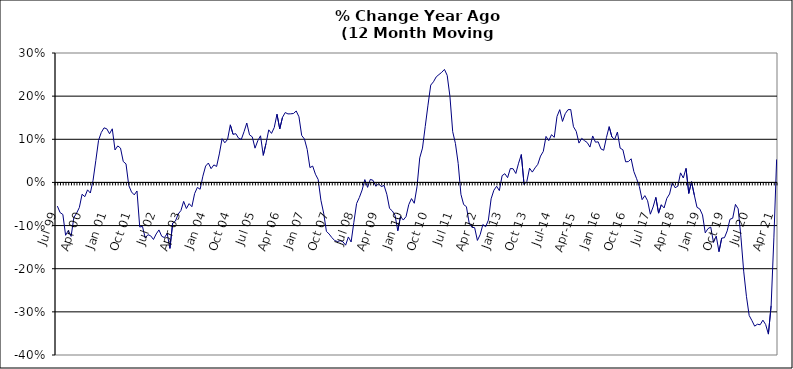
| Category | Series 0 |
|---|---|
| Jul 99 | -0.055 |
| Aug 99 | -0.07 |
| Sep 99 | -0.074 |
| Oct 99 | -0.123 |
| Nov 99 | -0.111 |
| Dec 99 | -0.125 |
| Jan 00 | -0.082 |
| Feb 00 | -0.071 |
| Mar 00 | -0.058 |
| Apr 00 | -0.027 |
| May 00 | -0.033 |
| Jun 00 | -0.017 |
| Jul 00 | -0.025 |
| Aug 00 | 0.005 |
| Sep 00 | 0.05 |
| Oct 00 | 0.098 |
| Nov 00 | 0.116 |
| Dec 00 | 0.127 |
| Jan 01 | 0.124 |
| Feb 01 | 0.113 |
| Mar 01 | 0.124 |
| Apr 01 | 0.075 |
| May 01 | 0.085 |
| Jun 01 | 0.08 |
| Jul 01 | 0.048 |
| Aug 01 | 0.043 |
| Sep 01 | -0.007 |
| Oct 01 | -0.022 |
| Nov 01 | -0.029 |
| Dec 01 | -0.02 |
| Jan 02 | -0.103 |
| Feb 02 | -0.102 |
| Mar 02 | -0.129 |
| Apr 02 | -0.121 |
| May 02 | -0.124 |
| Jun 02 | -0.132 |
| Jul 02 | -0.119 |
| Aug 02 | -0.11 |
| Sep 02 | -0.125 |
| Oct 02 | -0.128 |
| Nov 02 | -0.118 |
| Dec 02 | -0.153 |
| Jan 03 | -0.094 |
| Feb 03 | -0.09 |
| Mar 03 | -0.073 |
| Apr 03 | -0.065 |
| May 03 | -0.044 |
| Jun 03 | -0.06 |
| Jul 03 | -0.049 |
| Aug 03 | -0.056 |
| Sep 03 | -0.026 |
| Oct 03 | -0.012 |
| Nov 03 | -0.016 |
| Dec 03 | 0.014 |
| Jan 04 | 0.038 |
| Feb 04 | 0.045 |
| Mar 04 | 0.032 |
| Apr 04 | 0.041 |
| May 04 | 0.037 |
| Jun 04 | 0.066 |
| Jul 04 | 0.101 |
| Aug 04 | 0.092 |
| Sep 04 | 0.1 |
| Oct 04 | 0.133 |
| Nov 04 | 0.111 |
| Dec 04 | 0.113 |
| Jan 05 | 0.103 |
| Feb 05 | 0.1 |
| Mar 05 | 0.118 |
| Apr 05 | 0.138 |
| May 05 | 0.11 |
| Jun 05 | 0.106 |
| Jul 05 | 0.079 |
| Aug 05 | 0.097 |
| Sep 05 | 0.108 |
| Oct 05 | 0.063 |
| Nov 05 | 0.09 |
| Dec 05 | 0.122 |
| Jan 06 | 0.114 |
| Feb 06 | 0.127 |
| Mar 06 | 0.158 |
| Apr 06 | 0.124 |
| May 06 | 0.151 |
| Jun 06 | 0.162 |
| Jul 06 | 0.159 |
| Aug 06 | 0.159 |
| Sep 06 | 0.16 |
| Oct 06 | 0.166 |
| Nov 06 | 0.152 |
| Dec 06 | 0.109 |
| Jan 07 | 0.101 |
| Feb 07 | 0.076 |
| Mar 07 | 0.034 |
| Apr 07 | 0.038 |
| May 07 | 0.019 |
| Jun 07 | 0.007 |
| Jul 07 | -0.041 |
| Aug 07 | -0.071 |
| Sep 07 | -0.113 |
| Oct 07 | -0.12 |
| Nov 07 | -0.128 |
| Dec 07 | -0.135 |
| Jan 08 | -0.137 |
| Feb 08 | -0.135 |
| Mar 08 | -0.137 |
| Apr 08 | -0.145 |
| May 08 | -0.126 |
| Jun 08 | -0.138 |
| Jul 08 | -0.093 |
| Aug 08 | -0.049 |
| Sep-08 | -0.035 |
| Oct 08 | -0.018 |
| Nov 08 | 0.007 |
| Dec 08 | -0.011 |
| Jan 09 | 0.007 |
| Feb 09 | 0.005 |
| Mar 09 | -0.009 |
| Apr 09 | -0.003 |
| May 09 | -0.01 |
| Jun 09 | -0.007 |
| Jul 09 | -0.027 |
| Aug 09 | -0.06 |
| Sep 09 | -0.066 |
| Oct 09 | -0.076 |
| Nov 09 | -0.112 |
| Dec 09 | -0.079 |
| Jan 10 | -0.087 |
| Feb 10 | -0.079 |
| Mar 10 | -0.052 |
| Apr 10 | -0.037 |
| May 10 | -0.048 |
| Jun 10 | -0.01 |
| Jul 10 | 0.057 |
| Aug 10 | 0.08 |
| Sep 10 | 0.13 |
| Oct 10 | 0.179 |
| Nov 10 | 0.226 |
| Dec 10 | 0.233 |
| Jan 11 | 0.245 |
| Feb 11 | 0.25 |
| Mar 11 | 0.255 |
| Apr 11 | 0.262 |
| May 11 | 0.248 |
| Jun 11 | 0.199 |
| Jul 11 | 0.118 |
| Aug 11 | 0.09 |
| Sep 11 | 0.044 |
| Oct 11 | -0.028 |
| Nov 11 | -0.051 |
| Dec 11 | -0.056 |
| Jan 12 | -0.094 |
| Feb 12 | -0.104 |
| Mar 12 | -0.105 |
| Apr 12 | -0.134 |
| May 12 | -0.121 |
| Jun 12 | -0.098 |
| Jul 12 | -0.103 |
| Aug 12 | -0.087 |
| Sep 12 | -0.038 |
| Oct 12 | -0.018 |
| Nov 12 | -0.009 |
| Dec 12 | -0.019 |
| Jan 13 | 0.016 |
| Feb-13 | 0.02 |
| Mar-13 | 0.011 |
| Apr 13 | 0.032 |
| May 13 | 0.032 |
| Jun-13 | 0.021 |
| Jul 13 | 0.045 |
| Aug 13 | 0.065 |
| Sep 13 | -0.005 |
| Oct 13 | 0.002 |
| Nov 13 | 0.033 |
| Dec 13 | 0.024 |
| Jan 14 | 0.034 |
| Feb-14 | 0.042 |
| Mar 14 | 0.061 |
| Apr 14 | 0.072 |
| May 14 | 0.107 |
| Jun 14 | 0.097 |
| Jul-14 | 0.111 |
| Aug-14 | 0.105 |
| Sep 14 | 0.153 |
| Oct 14 | 0.169 |
| Nov 14 | 0.141 |
| Dec 14 | 0.159 |
| Jan 15 | 0.169 |
| Feb 15 | 0.169 |
| Mar 15 | 0.129 |
| Apr-15 | 0.118 |
| May 15 | 0.091 |
| Jun-15 | 0.102 |
| Jul 15 | 0.097 |
| Aug 15 | 0.092 |
| Sep 15 | 0.082 |
| Oct 15 | 0.108 |
| Nov 15 | 0.093 |
| Dec 15 | 0.094 |
| Jan 16 | 0.078 |
| Feb 16 | 0.075 |
| Mar 16 | 0.104 |
| Apr 16 | 0.129 |
| May 16 | 0.105 |
| Jun 16 | 0.1 |
| Jul 16 | 0.117 |
| Aug 16 | 0.08 |
| Sep 16 | 0.076 |
| Oct 16 | 0.048 |
| Nov 16 | 0.048 |
| Dec 16 | 0.055 |
| Jan 17 | 0.025 |
| Feb 17 | 0.009 |
| Mar 17 | -0.01 |
| Apr 17 | -0.04 |
| May 17 | -0.031 |
| Jun 17 | -0.042 |
| Jul 17 | -0.074 |
| Aug 17 | -0.057 |
| Sep 17 | -0.035 |
| Oct 17 | -0.071 |
| Nov 17 | -0.052 |
| Dec 17 | -0.059 |
| Jan 18 | -0.037 |
| Feb 18 | -0.027 |
| Mar 18 | 0 |
| Apr 18 | -0.012 |
| May 18 | -0.009 |
| Jun 18 | 0.022 |
| Jul 18 | 0.01 |
| Aug 18 | 0.033 |
| Sep 18 | -0.025 |
| Oct 18 | 0.002 |
| Nov 18 | -0.029 |
| Dec 18 | -0.058 |
| Jan 19 | -0.061 |
| Feb 19 | -0.075 |
| Mar 19 | -0.117 |
| Apr 19 | -0.107 |
| May 19 | -0.104 |
| Jun 19 | -0.139 |
| Jul 19 | -0.124 |
| Aug 19 | -0.16 |
| Sep 19 | -0.129 |
| Oct 19 | -0.128 |
| Nov 19 | -0.112 |
| Dec 19 | -0.085 |
| Jan 20 | -0.083 |
| Feb 20 | -0.051 |
| Mar 20 | -0.061 |
| Apr 20 | -0.127 |
| May 20 | -0.206 |
| Jun 20 | -0.264 |
| Jul 20 | -0.308 |
| Aug 20 | -0.32 |
| Sep 20 | -0.333 |
| Oct 20 | -0.329 |
| Nov 20 | -0.33 |
| Dec 20 | -0.319 |
| Jan 21 | -0.329 |
| Feb 21 | -0.352 |
| Mar 21 | -0.286 |
| Apr 21 | -0.129 |
| May 21 | 0.053 |